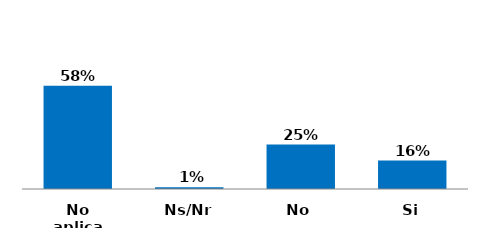
| Category | Series 0 |
|---|---|
| Si | 0.16 |
| No | 0.25 |
| Ns/Nr | 0.01 |
| No aplica | 0.58 |